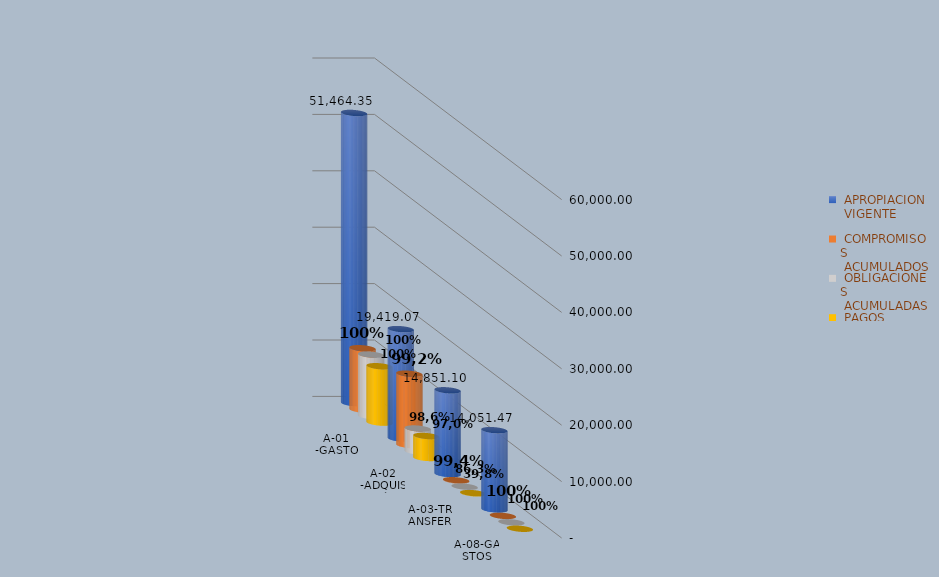
| Category |  APROPIACION
 VIGENTE |  COMPROMISOS
 ACUMULADOS |  OBLIGACIONES
 ACUMULADAS |  PAGOS
 ACUMULADOS |
|---|---|---|---|---|
| A-01 -GASTOS DE PERSONAL | 51464.345 | 10892.914 | 10892.914 | 9982.508 |
| A-02 -ADQUISICIÓN DE BIENES  Y SERVICIOS | 19419.071 | 12653.147 | 4072.846 | 3890.152 |
| A-03-TRANSFERENCIAS CORRIENTES | 14851.097 | 40.832 | 40.832 | 40.832 |
| A-08-GASTOS POR TRIBUTOS, MULTAS, SANCIONES E INTERESES DE MORA | 14051.472 | 0 | 0 | 0 |